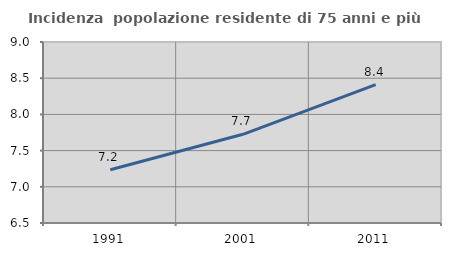
| Category | Incidenza  popolazione residente di 75 anni e più |
|---|---|
| 1991.0 | 7.235 |
| 2001.0 | 7.725 |
| 2011.0 | 8.41 |